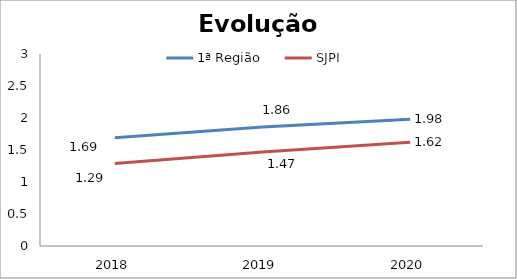
| Category | 1ª Região | SJPI |
|---|---|---|
| 0 | 1.69 | 1.29 |
| 1 | 1.86 | 1.47 |
| 2 | 1.98 | 1.62 |